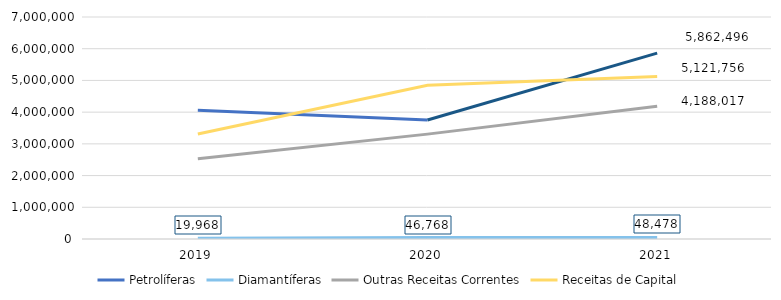
| Category | Petrolíferas | Diamantíferas | Outras Receitas Correntes | Receitas de Capital |
|---|---|---|---|---|
| 2019.0 | 4058524 | 19968 | 2531730 | 3309935 |
| 2020.0 | 3751656 | 46768 | 3306948 | 4849987 |
| 2021.0 | 5862496 | 48478 | 4188017 | 5121756 |